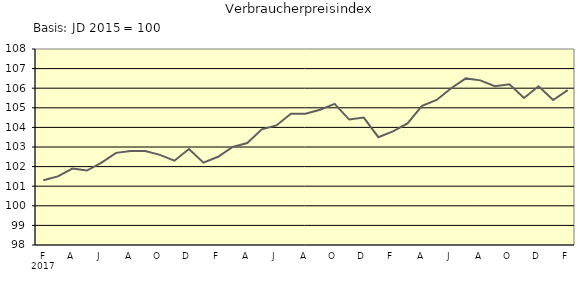
| Category | Series 0 |
|---|---|
| 0 | 101.3 |
| 1 | 101.5 |
| 2 | 101.9 |
| 3 | 101.8 |
| 4 | 102.2 |
| 5 | 102.7 |
| 6 | 102.8 |
| 7 | 102.8 |
| 8 | 102.6 |
| 9 | 102.3 |
| 10 | 102.9 |
| 11 | 102.2 |
| 12 | 102.5 |
| 13 | 103 |
| 14 | 103.2 |
| 15 | 103.9 |
| 16 | 104.1 |
| 17 | 104.7 |
| 18 | 104.7 |
| 19 | 104.9 |
| 20 | 105.2 |
| 21 | 104.4 |
| 22 | 104.5 |
| 23 | 103.5 |
| 24 | 103.8 |
| 25 | 104.2 |
| 26 | 105.1 |
| 27 | 105.4 |
| 28 | 106 |
| 29 | 106.5 |
| 30 | 106.4 |
| 31 | 106.1 |
| 32 | 106.2 |
| 33 | 105.5 |
| 34 | 106.1 |
| 35 | 105.4 |
| 36 | 105.9 |